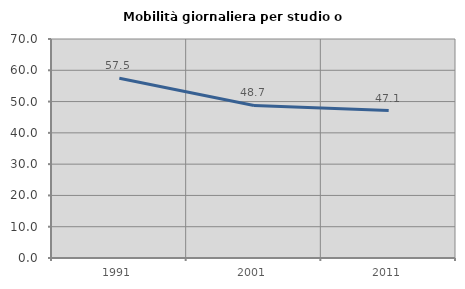
| Category | Mobilità giornaliera per studio o lavoro |
|---|---|
| 1991.0 | 57.455 |
| 2001.0 | 48.746 |
| 2011.0 | 47.119 |